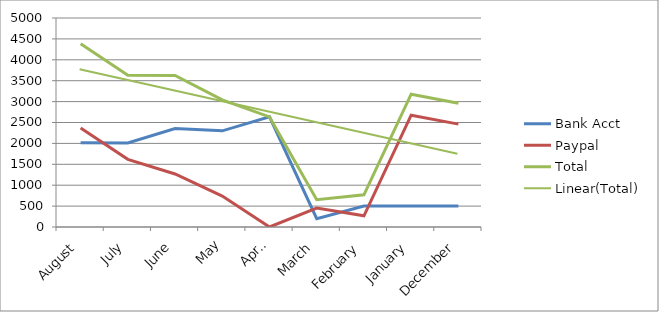
| Category | Bank Acct | Paypal | Total |
|---|---|---|---|
| August | 2018.09 | 2366.17 | 4384.26 |
| July | 2010.81 | 1617.82 | 3628.63 |
| June | 2357.06 | 1267.65 | 3624.71 |
| May | 2300.28 | 739.98 | 3040.26 |
| April | 2633.56 | 0 | 2633.56 |
| March | 199.47 | 454.06 | 653.53 |
| February | 501.68 | 267.99 | 769.67 |
| January | 501.68 | 2674.57 | 3176.25 |
| December | 501.68 | 2461.04 | 2962.72 |